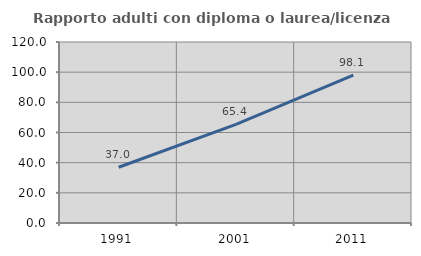
| Category | Rapporto adulti con diploma o laurea/licenza media  |
|---|---|
| 1991.0 | 36.95 |
| 2001.0 | 65.385 |
| 2011.0 | 98.065 |